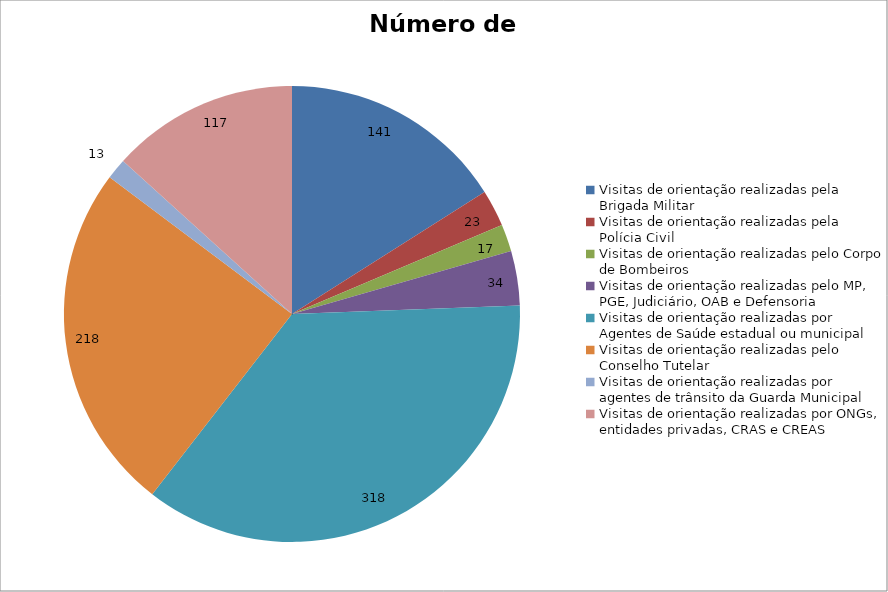
| Category | Número de Ações |
|---|---|
| Visitas de orientação realizadas pela Brigada Militar | 141 |
| Visitas de orientação realizadas pela Polícia Civil | 23 |
| Visitas de orientação realizadas pelo Corpo de Bombeiros | 17 |
| Visitas de orientação realizadas pelo MP, PGE, Judiciário, OAB e Defensoria | 34 |
| Visitas de orientação realizadas por Agentes de Saúde estadual ou municipal | 318 |
| Visitas de orientação realizadas pelo Conselho Tutelar | 218 |
| Visitas de orientação realizadas por agentes de trânsito da Guarda Municipal | 13 |
| Visitas de orientação realizadas por ONGs, entidades privadas, CRAS e CREAS | 117 |